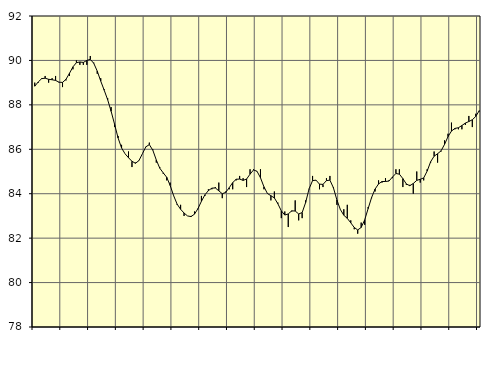
| Category | Piggar | Series 1 |
|---|---|---|
| nan | 89 | 88.84 |
| 87.0 | 89 | 89.03 |
| 87.0 | 89.2 | 89.18 |
| 87.0 | 89.3 | 89.2 |
| nan | 89 | 89.15 |
| 88.0 | 89.2 | 89.13 |
| 88.0 | 89.3 | 89.1 |
| 88.0 | 89 | 89.02 |
| nan | 88.8 | 89.01 |
| 89.0 | 89.1 | 89.15 |
| 89.0 | 89.3 | 89.42 |
| 89.0 | 89.6 | 89.71 |
| nan | 90 | 89.9 |
| 90.0 | 89.8 | 89.93 |
| 90.0 | 89.8 | 89.91 |
| 90.0 | 89.8 | 90 |
| nan | 90.2 | 90.05 |
| 91.0 | 89.9 | 89.87 |
| 91.0 | 89.4 | 89.52 |
| 91.0 | 89.2 | 89.07 |
| nan | 88.7 | 88.66 |
| 92.0 | 88.3 | 88.23 |
| 92.0 | 87.9 | 87.71 |
| 92.0 | 87 | 87.12 |
| nan | 86.6 | 86.51 |
| 93.0 | 86.2 | 86.06 |
| 93.0 | 85.8 | 85.8 |
| 93.0 | 85.9 | 85.62 |
| nan | 85.2 | 85.46 |
| 94.0 | 85.4 | 85.37 |
| 94.0 | 85.5 | 85.49 |
| 94.0 | 85.8 | 85.8 |
| nan | 86.1 | 86.11 |
| 95.0 | 86.3 | 86.21 |
| 95.0 | 86 | 85.96 |
| 95.0 | 85.4 | 85.52 |
| nan | 85.2 | 85.15 |
| 96.0 | 84.9 | 84.94 |
| 96.0 | 84.6 | 84.74 |
| 96.0 | 84.5 | 84.37 |
| nan | 83.9 | 83.91 |
| 97.0 | 83.5 | 83.53 |
| 97.0 | 83.5 | 83.3 |
| 97.0 | 83 | 83.13 |
| nan | 83 | 83 |
| 98.0 | 83 | 82.97 |
| 98.0 | 83.2 | 83.08 |
| 98.0 | 83.3 | 83.33 |
| nan | 83.9 | 83.66 |
| 99.0 | 83.9 | 83.95 |
| 99.0 | 84.2 | 84.14 |
| 99.0 | 84.2 | 84.25 |
| nan | 84.3 | 84.26 |
| 0.0 | 84.5 | 84.13 |
| 0.0 | 83.8 | 84 |
| 0.0 | 84.1 | 84.06 |
| nan | 84.2 | 84.27 |
| 1.0 | 84.2 | 84.5 |
| 1.0 | 84.6 | 84.65 |
| 1.0 | 84.8 | 84.66 |
| nan | 84.7 | 84.6 |
| 2.0 | 84.3 | 84.66 |
| 2.0 | 85.1 | 84.88 |
| 2.0 | 85.1 | 85.07 |
| nan | 85 | 85.01 |
| 3.0 | 85.1 | 84.72 |
| 3.0 | 84.2 | 84.31 |
| 3.0 | 84 | 84.01 |
| nan | 83.7 | 83.91 |
| 4.0 | 84.1 | 83.81 |
| 4.0 | 83.6 | 83.55 |
| 4.0 | 82.9 | 83.23 |
| nan | 83.2 | 83.04 |
| 5.0 | 82.5 | 83.09 |
| 5.0 | 83.2 | 83.23 |
| 5.0 | 83.7 | 83.22 |
| nan | 82.8 | 83.09 |
| 6.0 | 82.9 | 83.15 |
| 6.0 | 83.7 | 83.6 |
| 6.0 | 84.2 | 84.22 |
| nan | 84.8 | 84.59 |
| 7.0 | 84.6 | 84.61 |
| 7.0 | 84.2 | 84.43 |
| 7.0 | 84.3 | 84.42 |
| nan | 84.7 | 84.59 |
| 8.0 | 84.8 | 84.61 |
| 8.0 | 84.3 | 84.27 |
| 8.0 | 83.5 | 83.72 |
| nan | 83.3 | 83.29 |
| 9.0 | 83.3 | 83.03 |
| 9.0 | 83.5 | 82.89 |
| 9.0 | 82.8 | 82.69 |
| nan | 82.4 | 82.48 |
| 10.0 | 82.2 | 82.37 |
| 10.0 | 82.7 | 82.48 |
| 10.0 | 82.6 | 82.82 |
| nan | 83.4 | 83.33 |
| 11.0 | 83.8 | 83.83 |
| 11.0 | 84.1 | 84.21 |
| 11.0 | 84.6 | 84.44 |
| nan | 84.5 | 84.55 |
| 12.0 | 84.7 | 84.55 |
| 12.0 | 84.6 | 84.57 |
| 12.0 | 84.7 | 84.75 |
| nan | 85.1 | 84.91 |
| 13.0 | 85.1 | 84.88 |
| 13.0 | 84.3 | 84.68 |
| 13.0 | 84.4 | 84.44 |
| nan | 84.4 | 84.36 |
| 14.0 | 84 | 84.46 |
| 14.0 | 85 | 84.6 |
| 14.0 | 84.5 | 84.65 |
| nan | 84.6 | 84.71 |
| 15.0 | 85.1 | 85.02 |
| 15.0 | 85.4 | 85.44 |
| 15.0 | 85.9 | 85.69 |
| nan | 85.4 | 85.8 |
| 16.0 | 85.9 | 85.93 |
| 16.0 | 86.4 | 86.22 |
| 16.0 | 86.7 | 86.57 |
| nan | 87.2 | 86.82 |
| 17.0 | 86.9 | 86.94 |
| 17.0 | 86.9 | 86.97 |
| 17.0 | 86.9 | 87.07 |
| nan | 87.1 | 87.18 |
| 18.0 | 87.5 | 87.25 |
| 18.0 | 87 | 87.33 |
| 18.0 | 87.6 | 87.48 |
| nan | 87.7 | 87.74 |